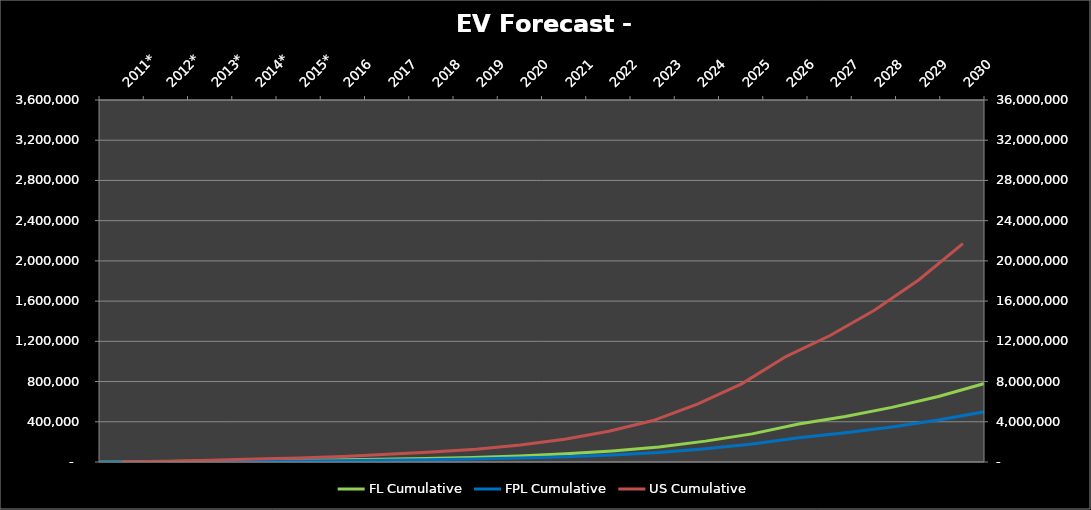
| Category | FL Cumulative | FPL Cumulative |
|---|---|---|
| 0 | 562 | 259 |
| 1 | 2539 | 1314 |
| 2 | 6377 | 4586 |
| 3 | 10068 | 7460 |
| 4 | 13911 | 9738 |
| 5 | 20042.748 | 12827.359 |
| 6 | 27635.904 | 17686.979 |
| 7 | 35538.84 | 22744.858 |
| 8 | 45262.908 | 28968.261 |
| 9 | 60821.424 | 38925.711 |
| 10 | 81825.408 | 52368.261 |
| 11 | 110180.844 | 70515.74 |
| 12 | 148460.616 | 95014.794 |
| 13 | 207520.884 | 132813.366 |
| 14 | 279869.688 | 179116.6 |
| 15 | 377540.568 | 241625.964 |
| 16 | 452886.696 | 289847.485 |
| 17 | 543302.028 | 347713.298 |
| 18 | 651800.412 | 417152.264 |
| 19 | 781998.516 | 500479.05 |